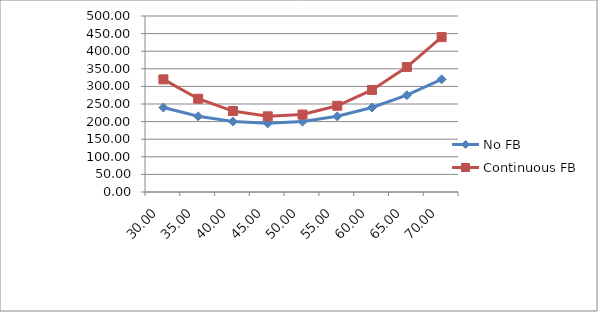
| Category | No FB | Continuous FB |
|---|---|---|
| 30.0 | 240 | 320 |
| 35.0 | 215 | 265 |
| 40.0 | 200 | 230 |
| 45.0 | 195 | 215 |
| 50.0 | 200 | 220 |
| 55.0 | 215 | 245 |
| 60.0 | 240 | 290 |
| 65.0 | 275 | 355 |
| 70.0 | 320 | 440 |